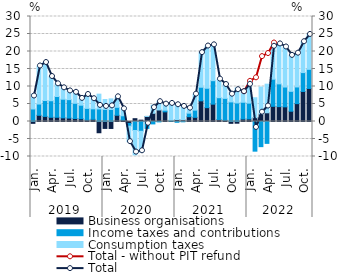
| Category | Business organisations | Income taxes and contributions | Consumption taxes |
|---|---|---|---|
| 0 | -0.527 | 3.58 | 4.234 |
| 1 | 1.772 | 3.218 | 10.866 |
| 2 | 1.459 | 4.532 | 10.864 |
| 3 | 1.205 | 4.726 | 6.921 |
| 4 | 1.208 | 5.935 | 3.624 |
| 5 | 1.043 | 5.328 | 3.256 |
| 6 | 0.987 | 5.26 | 2.488 |
| 7 | 0.861 | 4.346 | 3.135 |
| 8 | 0.792 | 3.865 | 1.948 |
| 9 | 0.435 | 3.31 | 3.975 |
| 10 | 0.634 | 2.986 | 2.891 |
| 11 | -3.213 | 3.59 | 4.224 |
| 12 | -1.976 | 3.45 | 2.832 |
| 13 | -1.989 | 3.421 | 3.038 |
| 14 | 1.781 | 2.274 | 3.006 |
| 15 | 0.406 | 1.231 | 1.975 |
| 16 | -0.559 | -0.78 | -4.415 |
| 17 | 0.801 | -2.564 | -6.973 |
| 18 | 0.384 | -2.793 | -5.955 |
| 19 | 1.44 | -1.969 | 0.018 |
| 20 | 2.347 | -0.689 | 2.308 |
| 21 | 3.295 | -0.11 | 2.486 |
| 22 | 2.762 | 0.464 | 1.731 |
| 23 | 0.106 | 0.255 | 4.802 |
| 24 | 0.572 | -0.223 | 4.439 |
| 25 | 0.497 | -0.084 | 3.905 |
| 26 | 1.377 | 1.005 | 1.427 |
| 27 | 1.191 | 2.054 | 4.574 |
| 28 | 5.907 | 3.881 | 9.892 |
| 29 | 3.958 | 5.539 | 12.065 |
| 30 | 4.954 | 6.711 | 10.241 |
| 31 | 0.574 | 6.229 | 5.305 |
| 32 | 0.349 | 6.26 | 3.958 |
| 33 | -0.523 | 5.599 | 2.731 |
| 34 | -0.486 | 5.299 | 4.279 |
| 35 | 0.721 | 4.777 | 3.018 |
| 36 | 0.722 | 4.531 | 5.37 |
| 37 | 1.09 | -8.475 | 5.696 |
| 38 | 2.117 | -7.185 | 7.726 |
| 39 | 2.491 | -6.25 | 8.175 |
| 40 | 4.337 | 7.75 | 9.398 |
| 41 | 4.249 | 6.505 | 11.421 |
| 42 | 4.188 | 5.661 | 11.44 |
| 43 | 2.939 | 5.682 | 10.271 |
| 44 | 5.106 | 4.763 | 9.651 |
| 45 | 8.585 | 5.392 | 8.817 |
| 46 | 9.439 | 5.469 | 9.966 |